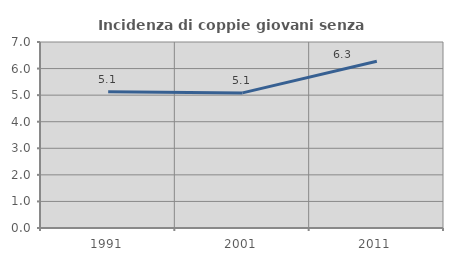
| Category | Incidenza di coppie giovani senza figli |
|---|---|
| 1991.0 | 5.128 |
| 2001.0 | 5.085 |
| 2011.0 | 6.275 |